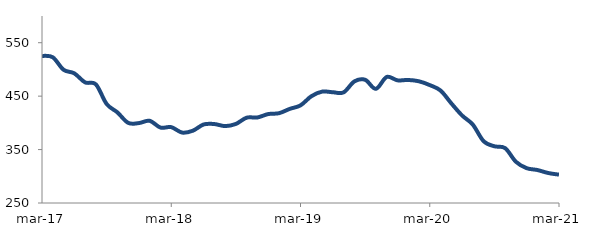
| Category | Series 0 |
|---|---|
| 2017-03-01 | 525.293 |
| 2017-04-01 | 522.767 |
| 2017-05-01 | 499.403 |
| 2017-06-01 | 492.658 |
| 2017-07-01 | 475.773 |
| 2017-08-01 | 472.095 |
| 2017-09-01 | 435.36 |
| 2017-10-01 | 419.613 |
| 2017-11-01 | 399.993 |
| 2017-12-01 | 399.593 |
| 2018-01-01 | 403.819 |
| 2018-02-01 | 391.148 |
| 2018-03-01 | 391.982 |
| 2018-04-01 | 381.858 |
| 2018-05-01 | 385.253 |
| 2018-06-01 | 396.938 |
| 2018-07-01 | 397.791 |
| 2018-08-01 | 393.946 |
| 2018-09-01 | 397.991 |
| 2018-10-01 | 409.681 |
| 2018-11-01 | 410.109 |
| 2018-12-01 | 416.457 |
| 2019-01-01 | 418.023 |
| 2019-02-01 | 426.141 |
| 2019-03-01 | 432.718 |
| 2019-04-01 | 449.714 |
| 2019-05-01 | 458.458 |
| 2019-06-01 | 457.312 |
| 2019-07-01 | 457.058 |
| 2019-08-01 | 477.544 |
| 2019-09-01 | 480.652 |
| 2019-10-01 | 463.67 |
| 2019-11-01 | 485.887 |
| 2019-12-01 | 479.593 |
| 2020-01-01 | 480.293 |
| 2020-02-01 | 477.774 |
| 2020-03-01 | 470.708 |
| 2020-04-01 | 460.537 |
| 2020-05-01 | 436.562 |
| 2020-06-01 | 413.857 |
| 2020-07-01 | 396.652 |
| 2020-08-01 | 365.687 |
| 2020-09-01 | 356.18 |
| 2020-10-01 | 352.658 |
| 2020-11-01 | 327.164 |
| 2020-12-01 | 315.173 |
| 2021-01-01 | 311.708 |
| 2021-02-01 | 306.103 |
| 2021-03-01 | 303.075 |